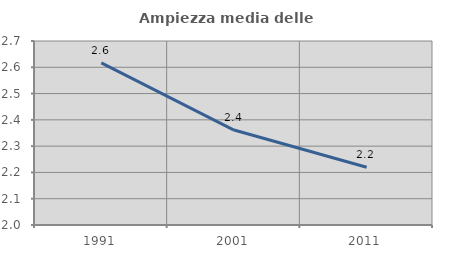
| Category | Ampiezza media delle famiglie |
|---|---|
| 1991.0 | 2.617 |
| 2001.0 | 2.361 |
| 2011.0 | 2.22 |